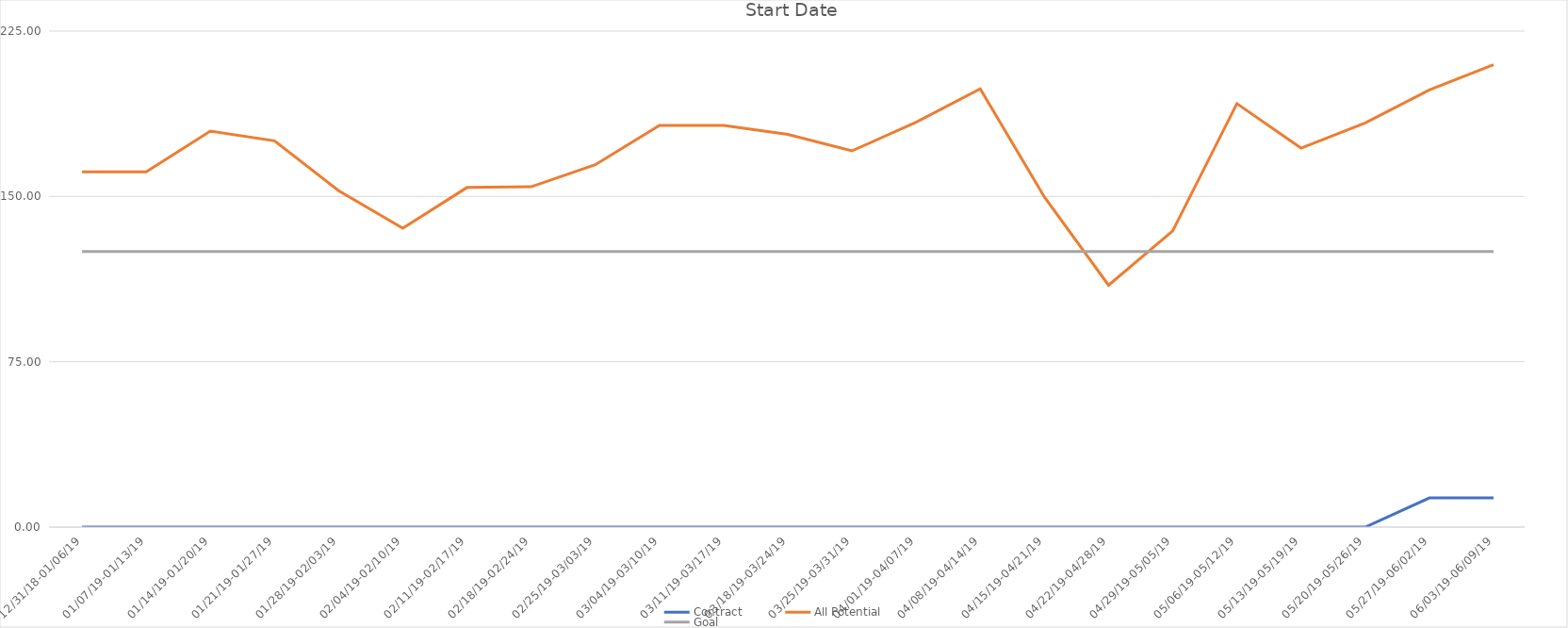
| Category | Contract | All Potential  | Goal |
|---|---|---|---|
| 12/31/18-01/06/19 | 0 | 161.155 | 125 |
| 01/07/19-01/13/19 | 0 | 161.155 | 125 |
| 01/14/19-01/20/19 | 0 | 179.617 | 125 |
| 01/21/19-01/27/19 | 0 | 175.242 | 125 |
| 01/28/19-02/03/19 | 0 | 152.613 | 125 |
| 02/04/19-02/10/19 | 0 | 135.607 | 125 |
| 02/11/19-02/17/19 | 0 | 154.049 | 125 |
| 02/18/19-02/24/19 | 0 | 154.382 | 125 |
| 02/25/19-03/03/19 | 0 | 164.382 | 125 |
| 03/04/19-03/10/19 | 0 | 182.224 | 125 |
| 03/11/19-03/17/19 | 0 | 182.224 | 125 |
| 03/18/19-03/24/19 | 0 | 178.162 | 125 |
| 03/25/19-03/31/19 | 0 | 170.662 | 125 |
| 04/01/19-04/07/19 | 0 | 183.66 | 125 |
| 04/08/19-04/14/19 | 0 | 198.807 | 125 |
| 04/15/19-04/21/19 | 0 | 149.72 | 125 |
| 04/22/19-04/28/19 | 0 | 109.72 | 125 |
| 04/29/19-05/05/19 | 0 | 134.365 | 125 |
| 05/06/19-05/12/19 | 0 | 192.111 | 125 |
| 05/13/19-05/19/19 | 0 | 171.933 | 125 |
| 05/20/19-05/26/19 | 0 | 183.382 | 125 |
| 05/27/19-06/02/19 | 13.234 | 198.282 | 125 |
| 06/03/19-06/09/19 | 13.234 | 209.746 | 125 |